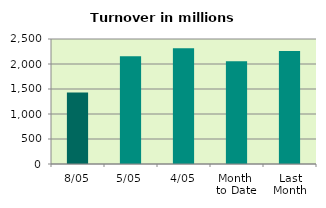
| Category | Series 0 |
|---|---|
| 8/05 | 1431.234 |
| 5/05 | 2156.109 |
| 4/05 | 2315.385 |
| Month 
to Date | 2052.586 |
| Last
Month | 2261.282 |